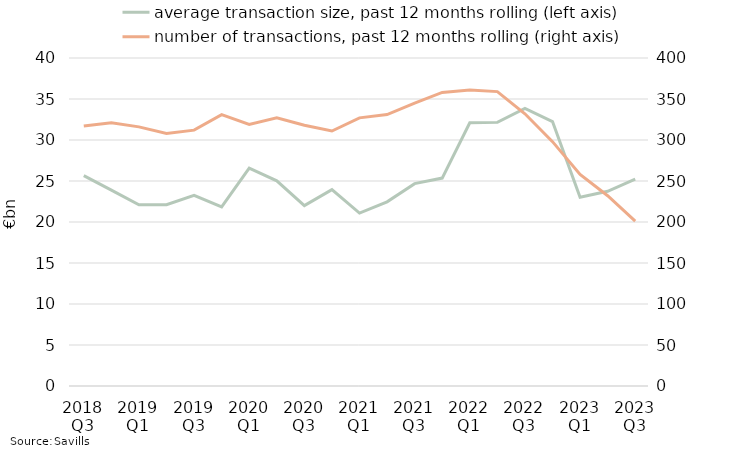
| Category | average transaction size, past 12 months rolling (left axis) |
|---|---|
| 2018 Q3 | 25646187.502 |
| 2018 Q4 | 23884098.101 |
| 2019 Q1 | 22105124.01 |
| 2019 Q2 | 22110130.055 |
| 2019 Q3 | 23257657.317 |
| 2019 Q4 | 21833099.458 |
| 2020 Q1 | 26554944.117 |
| 2020 Q2 | 25018757.979 |
| 2020 Q3 | 21992255.042 |
| 2020 Q4 | 23943383.767 |
| 2021 Q1 | 21081233.96 |
| 2021 Q2 | 22461802.317 |
| 2021 Q3 | 24676724.725 |
| 2021 Q4 | 25356390.181 |
| 2022 Q1 | 32104461.537 |
| 2022 Q2 | 32149184.791 |
| 2022 Q3 | 33857164.632 |
| 2022 Q4 | 32242978.02 |
| 2023 Q1 | 23013020.484 |
| 2023 Q2 | 23741956.728 |
| 2023 Q3 | 25218294.069 |